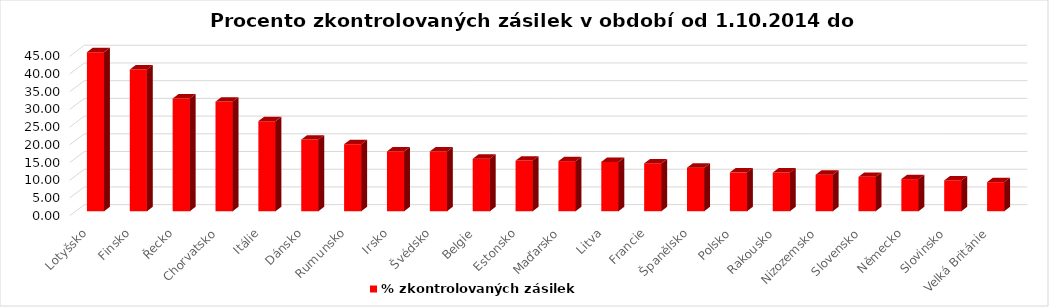
| Category | % zkontrolovaných zásilek |
|---|---|
| Lotyšsko | 44.898 |
| Finsko | 40 |
| Řecko | 31.818 |
| Chorvatsko | 30.952 |
| Itálie | 25.434 |
| Dánsko | 20.22 |
| Rumunsko | 18.919 |
| Irsko | 16.892 |
| Švédsko | 16.883 |
| Belgie | 14.807 |
| Estonsko | 14.286 |
| Maďarsko | 14.134 |
| Litva | 13.924 |
| Francie | 13.502 |
| Španělsko | 12.287 |
| Polsko | 10.97 |
| Rakousko | 10.926 |
| Nizozemsko | 10.302 |
| Slovensko | 9.704 |
| Německo | 9.076 |
| Slovinsko | 8.696 |
| Velká Británie | 8.215 |